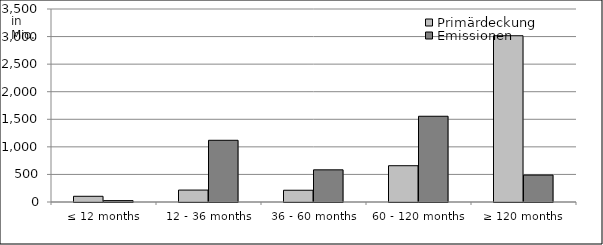
| Category | Primärdeckung | Emissionen |
|---|---|---|
| ≤ 12 months | 103464132.7 | 25000000 |
| 12 - 36 months | 216257170.392 | 1119006666.46 |
| 36 - 60 months | 213322265.499 | 583150000 |
| 60 - 120 months | 658128436.748 | 1555000000 |
| ≥ 120 months | 3015169778.242 | 488144003.11 |